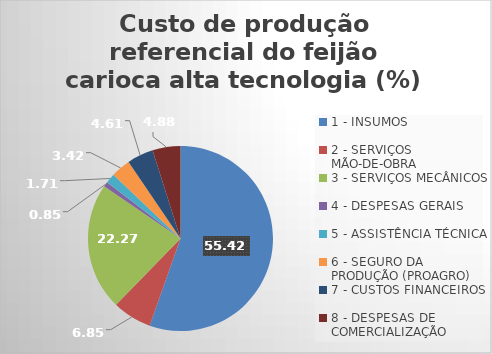
| Category | Series 0 |
|---|---|
| 1 - INSUMOS | 55.419 |
| 2 - SERVIÇOS MÃO-DE-OBRA | 6.847 |
| 3 - SERVIÇOS MECÂNICOS | 22.271 |
| 4 - DESPESAS GERAIS  | 0.845 |
| 5 - ASSISTÊNCIA TÉCNICA | 1.708 |
| 6 - SEGURO DA PRODUÇÃO (PROAGRO) | 3.415 |
| 7 - CUSTOS FINANCEIROS | 4.611 |
| 8 - DESPESAS DE COMERCIALIZAÇÃO | 4.884 |